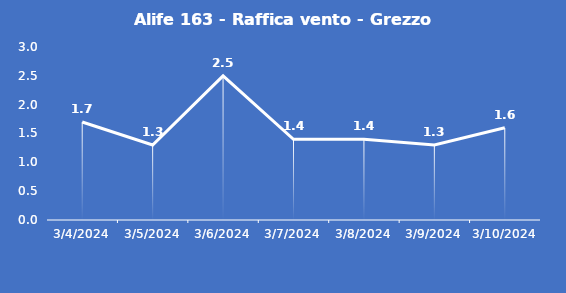
| Category | Alife 163 - Raffica vento - Grezzo (m/s) |
|---|---|
| 3/4/24 | 1.7 |
| 3/5/24 | 1.3 |
| 3/6/24 | 2.5 |
| 3/7/24 | 1.4 |
| 3/8/24 | 1.4 |
| 3/9/24 | 1.3 |
| 3/10/24 | 1.6 |